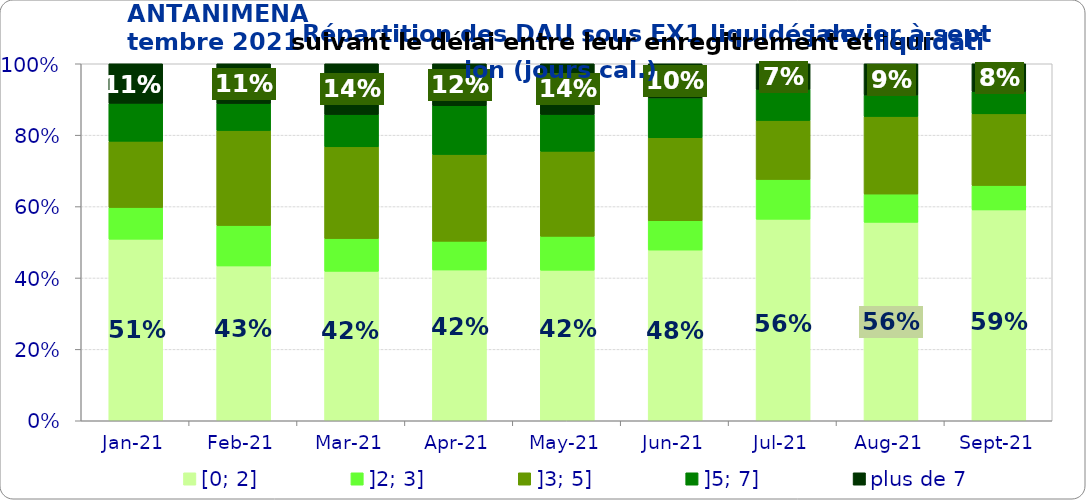
| Category | [0; 2] | ]2; 3] | ]3; 5] | ]5; 7] | plus de 7 |
|---|---|---|---|---|---|
| 2021-01-01 | 0.509 | 0.089 | 0.185 | 0.106 | 0.111 |
| 2021-02-01 | 0.434 | 0.113 | 0.266 | 0.076 | 0.112 |
| 2021-03-01 | 0.419 | 0.092 | 0.257 | 0.09 | 0.142 |
| 2021-04-01 | 0.422 | 0.08 | 0.243 | 0.137 | 0.117 |
| 2021-05-01 | 0.422 | 0.095 | 0.238 | 0.103 | 0.142 |
| 2021-06-01 | 0.478 | 0.082 | 0.233 | 0.111 | 0.096 |
| 2021-07-01 | 0.564 | 0.112 | 0.165 | 0.087 | 0.072 |
| 2021-08-01 | 0.556 | 0.079 | 0.217 | 0.06 | 0.088 |
| 2021-09-01 | 0.591 | 0.069 | 0.201 | 0.063 | 0.078 |